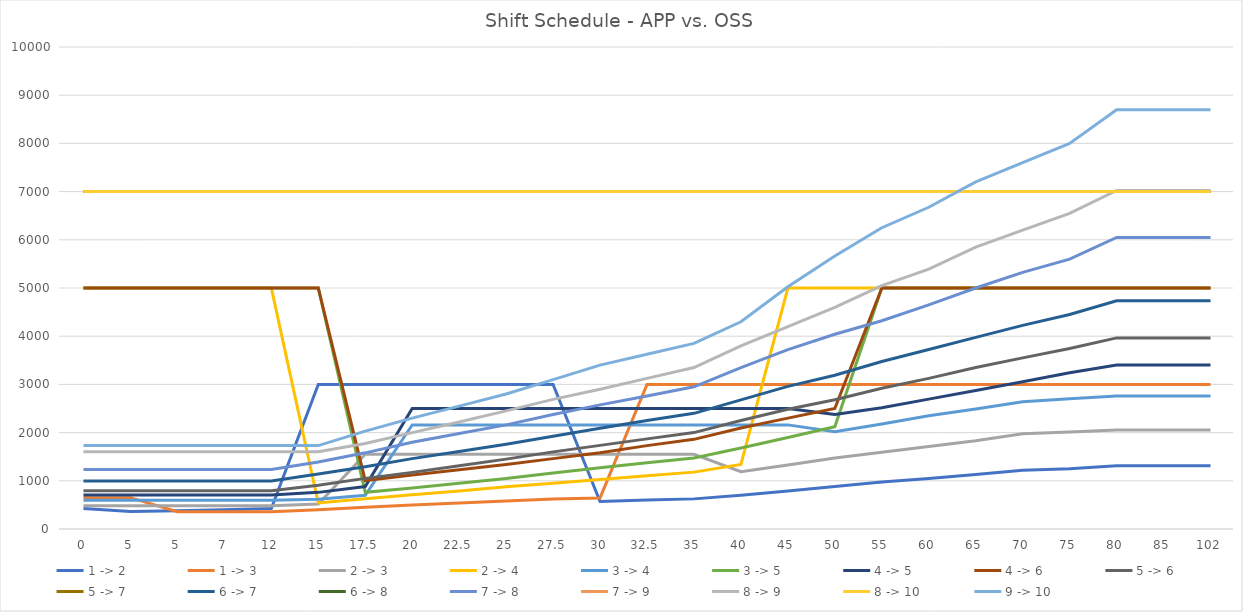
| Category | 1 -> 2 | 1 -> 3 | 2 -> 3 | 2 -> 4 | 3 -> 4 | 3 -> 5 | 4 -> 5 | 4 -> 6 | 5 -> 6 | 5 -> 7 | 6 -> 7 | 6 -> 8 | 7 -> 8 | 7 -> 9 | 8 -> 9 | 8 -> 10 | 9 -> 10 |
|---|---|---|---|---|---|---|---|---|---|---|---|---|---|---|---|---|---|
| 0.0 | 425 | 650 | 480 | 5000 | 595 | 5000 | 705 | 5000 | 795 | 7000 | 995 | 7000 | 1235 | 7000 | 1605 | 7000 | 1730 |
| 5.0 | 365 | 650 | 480 | 5000 | 595 | 5000 | 705 | 5000 | 795 | 7000 | 995 | 7000 | 1235 | 7000 | 1605 | 7000 | 1730 |
| 5.0 | 380 | 360 | 480 | 5000 | 595 | 5000 | 705 | 5000 | 795 | 7000 | 995 | 7000 | 1235 | 7000 | 1605 | 7000 | 1730 |
| 7.0 | 400 | 360 | 480 | 5000 | 595 | 5000 | 705 | 5000 | 795 | 7000 | 995 | 7000 | 1235 | 7000 | 1605 | 7000 | 1730 |
| 12.0 | 425 | 360 | 480 | 5000 | 595 | 5000 | 705 | 5000 | 795 | 7000 | 995 | 7000 | 1235 | 7000 | 1605 | 7000 | 1730 |
| 15.0 | 3000 | 400 | 520 | 540 | 615 | 5000 | 760 | 5000 | 910 | 7000 | 1140 | 7000 | 1390 | 7000 | 1605 | 7000 | 1730 |
| 17.5 | 3000 | 450 | 1550 | 630 | 700 | 760 | 880 | 1005 | 1050 | 7000 | 1290 | 7000 | 1580 | 7000 | 1775 | 7000 | 2030 |
| 20.0 | 3000 | 500 | 1550 | 710 | 2160 | 850 | 2500 | 1120 | 1175 | 7000 | 1460 | 7000 | 1800 | 7000 | 2000 | 7000 | 2300 |
| 22.5 | 3000 | 540 | 1550 | 790 | 2160 | 950 | 2500 | 1230 | 1310 | 7000 | 1610 | 7000 | 1980 | 7000 | 2220 | 7000 | 2550 |
| 25.0 | 3000 | 580 | 1550 | 875 | 2160 | 1050 | 2500 | 1340 | 1450 | 7000 | 1760 | 7000 | 2160 | 7000 | 2450 | 7000 | 2800 |
| 27.5 | 3000 | 620 | 1550 | 950 | 2160 | 1160 | 2500 | 1460 | 1600 | 7000 | 1925 | 7000 | 2375 | 7000 | 2690 | 7000 | 3100 |
| 30.0 | 570 | 645 | 1550 | 1025 | 2160 | 1270 | 2500 | 1580 | 1735 | 7000 | 2090 | 7000 | 2575 | 7000 | 2900 | 7000 | 3400 |
| 32.5 | 600 | 3000 | 1550 | 1105 | 2160 | 1375 | 2500 | 1730 | 1870 | 7000 | 2250 | 7000 | 2760 | 7000 | 3125 | 7000 | 3625 |
| 35.0 | 625 | 3000 | 1550 | 1180 | 2160 | 1475 | 2500 | 1860 | 2000 | 7000 | 2400 | 7000 | 2950 | 7000 | 3350 | 7000 | 3850 |
| 40.0 | 700 | 3000 | 1190 | 1340 | 2160 | 1680 | 2500 | 2095 | 2250 | 7000 | 2680 | 7000 | 3350 | 7000 | 3800 | 7000 | 4300 |
| 45.0 | 790 | 3000 | 1330 | 5000 | 2160 | 1900 | 2500 | 2300 | 2485 | 7000 | 2960 | 7000 | 3720 | 7000 | 4200 | 7000 | 5025 |
| 50.0 | 880 | 3000 | 1475 | 5000 | 2020 | 2120 | 2375 | 2500 | 2680 | 7000 | 3190 | 7000 | 4040 | 7000 | 4600 | 7000 | 5665 |
| 55.0 | 975 | 3000 | 1590 | 5000 | 2180 | 5000 | 2515 | 5000 | 2920 | 7000 | 3475 | 7000 | 4320 | 7000 | 5050 | 7000 | 6250 |
| 60.0 | 1050 | 3000 | 1710 | 5000 | 2350 | 5000 | 2695 | 5000 | 3125 | 7000 | 3725 | 7000 | 4650 | 7000 | 5390 | 7000 | 6675 |
| 65.0 | 1130 | 3000 | 1830 | 5000 | 2490 | 5000 | 2875 | 5000 | 3350 | 7000 | 3975 | 7000 | 5000 | 7000 | 5850 | 7000 | 7200 |
| 70.0 | 1220 | 3000 | 1975 | 5000 | 2640 | 5000 | 3055 | 5000 | 3550 | 7000 | 4225 | 7000 | 5325 | 7000 | 6200 | 7000 | 7600 |
| 75.0 | 1250 | 3000 | 2010 | 5000 | 2700 | 5000 | 3240 | 5000 | 3745 | 7000 | 4450 | 7000 | 5600 | 7000 | 6550 | 7000 | 8000 |
| 80.0 | 1310 | 3000 | 2055 | 5000 | 2760 | 5000 | 3400 | 5000 | 3965 | 7000 | 4735 | 7000 | 6050 | 7000 | 7025 | 7000 | 8700 |
| 85.0 | 1310 | 3000 | 2055 | 5000 | 2760 | 5000 | 3400 | 5000 | 3965 | 7000 | 4735 | 7000 | 6050 | 7000 | 7025 | 7000 | 8700 |
| 102.0 | 1310 | 3000 | 2055 | 5000 | 2760 | 5000 | 3400 | 5000 | 3965 | 7000 | 4735 | 7000 | 6050 | 7000 | 7025 | 7000 | 8700 |